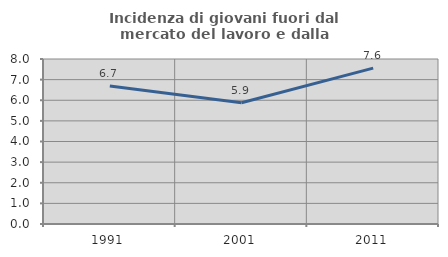
| Category | Incidenza di giovani fuori dal mercato del lavoro e dalla formazione  |
|---|---|
| 1991.0 | 6.692 |
| 2001.0 | 5.875 |
| 2011.0 | 7.556 |